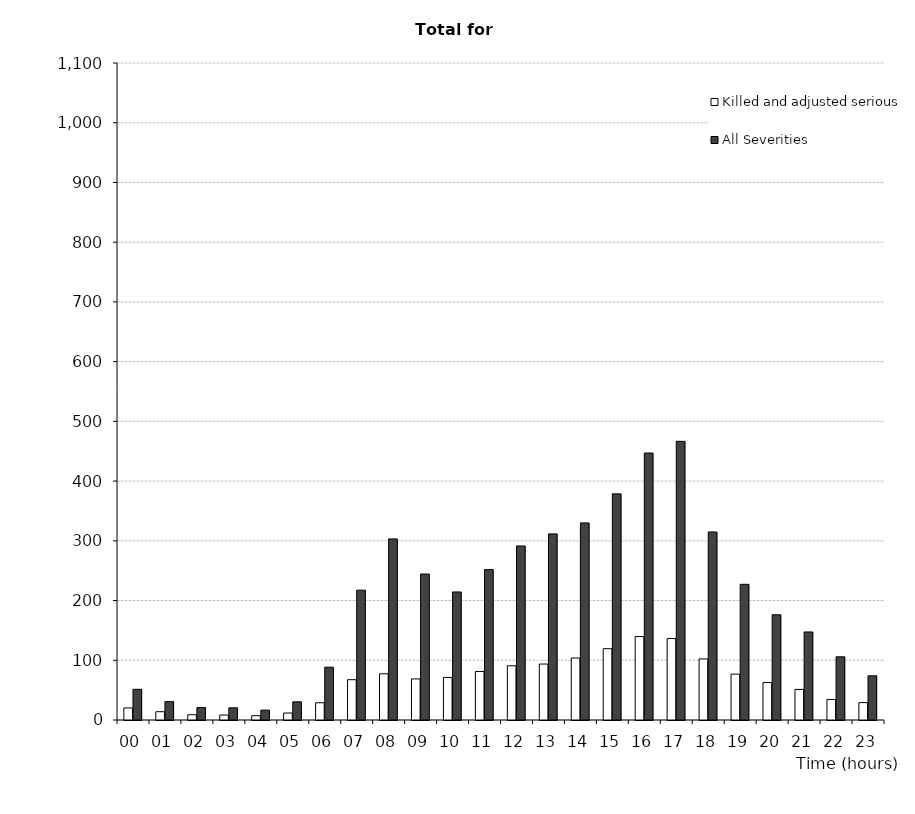
| Category | Killed and adjusted serious | All Severities |
|---|---|---|
| 00 | 20.2 | 51.4 |
| 01 | 13.9 | 30.8 |
| 02 | 8.8 | 20.8 |
| 03 | 8.3 | 20.4 |
| 04 | 7.2 | 16.6 |
| 05 | 11.7 | 30.4 |
| 06 | 28.9 | 88.4 |
| 07 | 67.5 | 217.4 |
| 08 | 77.4 | 303.2 |
| 09 | 68.8 | 244.4 |
| 10 | 71.3 | 214.4 |
| 11 | 81.3 | 251.8 |
| 12 | 90.8 | 291.4 |
| 13 | 93.7 | 311.6 |
| 14 | 103.8 | 330 |
| 15 | 119.4 | 378.6 |
| 16 | 139.7 | 447 |
| 17 | 136.4 | 466.6 |
| 18 | 102.3 | 314.8 |
| 19 | 76.8 | 227.2 |
| 20 | 62.8 | 176.2 |
| 21 | 51.2 | 147.4 |
| 22 | 34.4 | 105.8 |
| 23 | 29.1 | 74 |